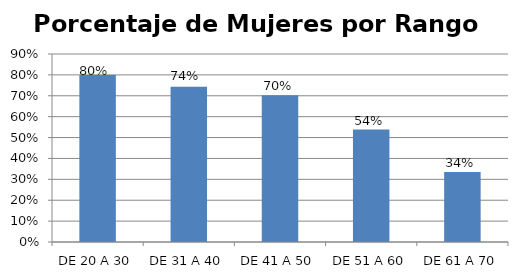
| Category | Porcentaje |
|---|---|
| DE 20 A 30 | 0.8 |
| DE 31 A 40 | 0.743 |
| DE 41 A 50 | 0.702 |
| DE 51 A 60 | 0.538 |
| DE 61 A 70 | 0.335 |